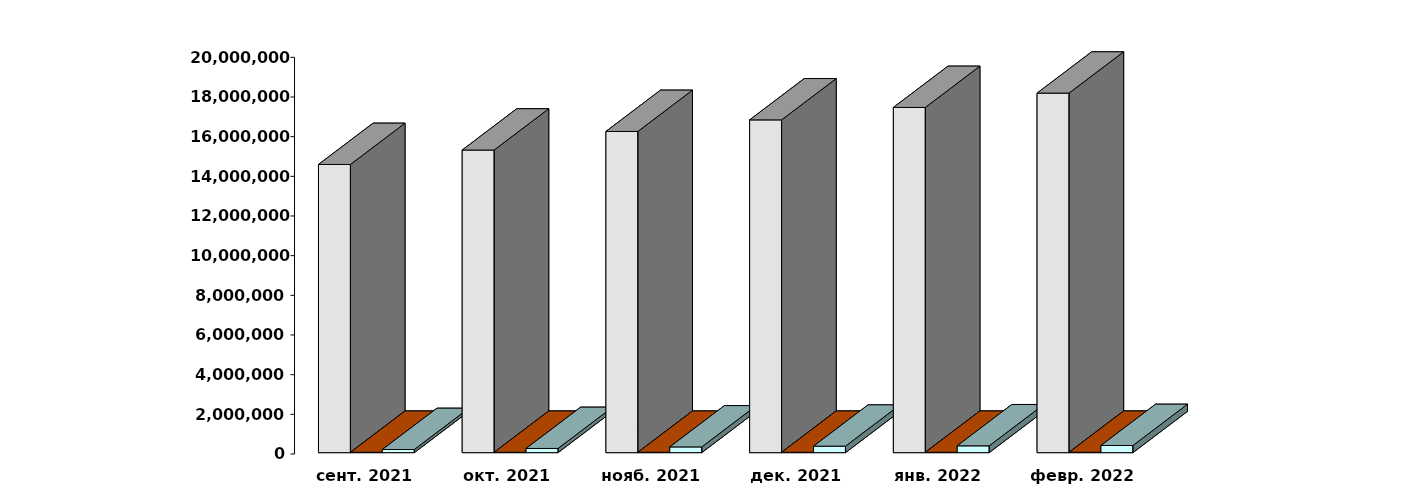
| Category | Физические лица | Юридические лица | Клиенты, передавшие свои средства в ДУ |
|---|---|---|---|
| 2021-09-28 | 14530193 | 20081 | 158895 |
| 2021-10-28 | 15258509 | 20154 | 212008 |
| 2021-11-28 | 16196130 | 20272 | 288895 |
| 2021-12-28 | 16779069 | 20446 | 327432 |
| 2022-01-28 | 17405817 | 20536 | 345411 |
| 2022-02-28 | 18128529 | 20698 | 361205 |